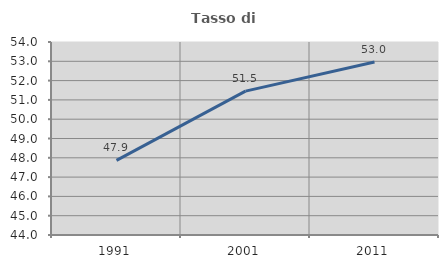
| Category | Tasso di occupazione   |
|---|---|
| 1991.0 | 47.869 |
| 2001.0 | 51.455 |
| 2011.0 | 52.961 |